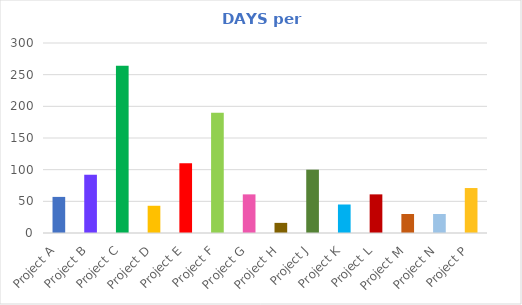
| Category | # of DAYS |
|---|---|
| Project A | 57 |
| Project B | 92 |
| Project C | 264 |
| Project D | 43 |
| Project E | 110 |
| Project F | 190 |
| Project G | 61 |
| Project H | 16 |
| Project J | 100 |
| Project K | 45 |
| Project L | 61 |
| Project M | 30 |
| Project N | 30 |
| Project P | 71 |